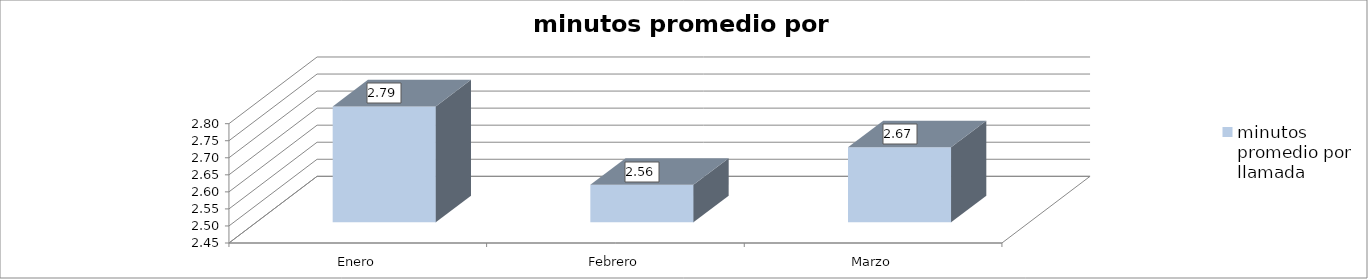
| Category | minutos promedio por llamada |
|---|---|
| Enero | 2.79 |
| Febrero | 2.56 |
| Marzo | 2.67 |